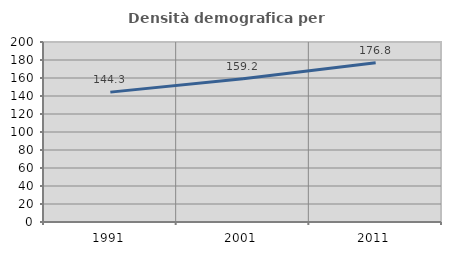
| Category | Densità demografica |
|---|---|
| 1991.0 | 144.299 |
| 2001.0 | 159.162 |
| 2011.0 | 176.846 |